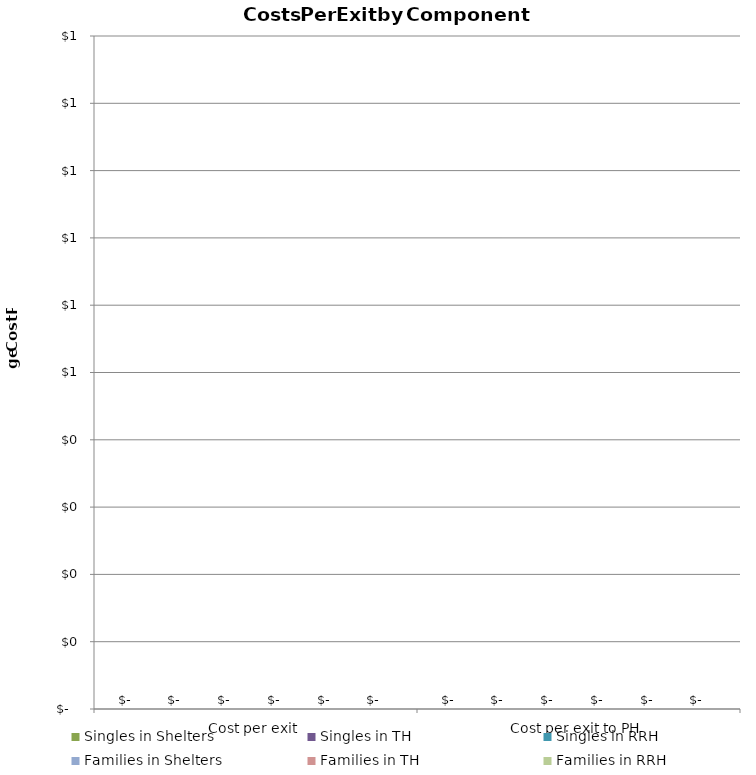
| Category | Singles in Shelters | Singles in TH | Singles in RRH | Families in Shelters | Families in TH | Families in RRH |
|---|---|---|---|---|---|---|
|  Cost per exit  | 0 | 0 | 0 | 0 | 0 | 0 |
|  Cost per exit to PH  | 0 | 0 | 0 | 0 | 0 | 0 |